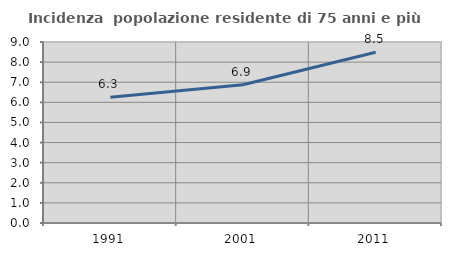
| Category | Incidenza  popolazione residente di 75 anni e più |
|---|---|
| 1991.0 | 6.258 |
| 2001.0 | 6.876 |
| 2011.0 | 8.49 |